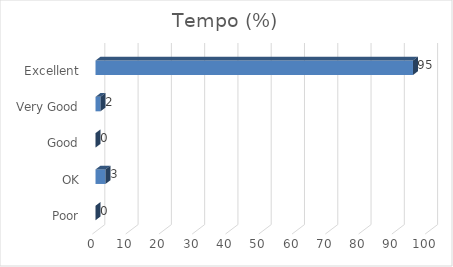
| Category | Tempo (%) |
|---|---|
| Poor | 0 |
| OK | 3 |
| Good | 0 |
| Very Good | 1.5 |
| Excellent | 95.4 |